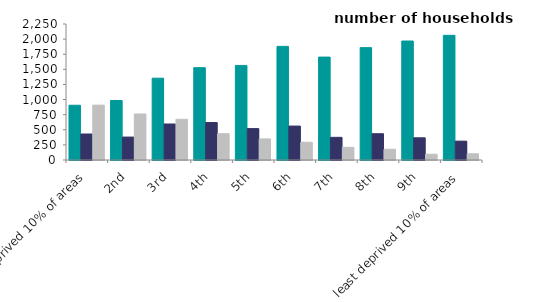
| Category | owner occupied | private rented | social rented |
|---|---|---|---|
| most deprived 10% of areas | 905.623 | 430.012 | 907.572 |
| 2nd | 983.892 | 379.228 | 761.503 |
| 3rd | 1353.333 | 595.629 | 673.342 |
| 4th | 1527.556 | 620.033 | 435.132 |
| 5th | 1564.345 | 519.71 | 348.715 |
| 6th | 1879.734 | 561.47 | 293.642 |
| 7th | 1702.307 | 374.835 | 209.967 |
| 8th | 1858.97 | 434.633 | 177.697 |
| 9th | 1968.458 | 367.267 | 95.744 |
| least deprived 10% of areas | 2062.691 | 311.914 | 102.978 |